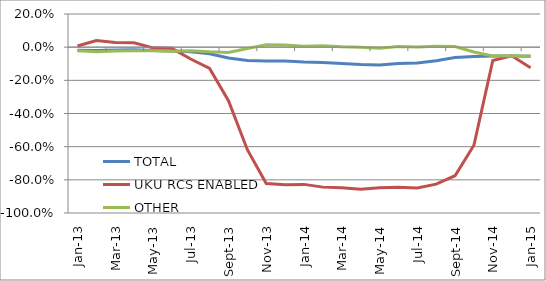
| Category | TOTAL | UKU RCS ENABLED | OTHER |
|---|---|---|---|
| 2013-01-01 | -0.018 | 0.007 | -0.021 |
| 2013-02-01 | -0.021 | 0.04 | -0.028 |
| 2013-03-01 | -0.017 | 0.028 | -0.022 |
| 2013-04-01 | -0.016 | 0.026 | -0.022 |
| 2013-05-01 | -0.02 | -0.004 | -0.022 |
| 2013-06-01 | -0.023 | -0.007 | -0.025 |
| 2013-07-01 | -0.028 | -0.071 | -0.022 |
| 2013-08-01 | -0.04 | -0.128 | -0.028 |
| 2013-09-01 | -0.065 | -0.323 | -0.031 |
| 2013-10-01 | -0.08 | -0.618 | -0.009 |
| 2013-11-01 | -0.084 | -0.822 | 0.015 |
| 2013-12-01 | -0.083 | -0.83 | 0.014 |
| 2014-01-01 | -0.089 | -0.827 | 0.005 |
| 2014-02-01 | -0.092 | -0.844 | 0.009 |
| 2014-03-01 | -0.098 | -0.848 | 0.003 |
| 2014-04-01 | -0.104 | -0.857 | -0.001 |
| 2014-05-01 | -0.107 | -0.848 | -0.006 |
| 2014-06-01 | -0.099 | -0.845 | 0.004 |
| 2014-07-01 | -0.095 | -0.849 | 0.001 |
| 2014-08-01 | -0.082 | -0.826 | 0.006 |
| 2014-09-01 | -0.062 | -0.775 | 0.003 |
| 2014-10-01 | -0.057 | -0.591 | -0.029 |
| 2014-11-01 | -0.054 | -0.081 | -0.053 |
| 2014-12-01 | -0.053 | -0.052 | -0.053 |
| 2015-01-01 | -0.055 | -0.124 | -0.054 |